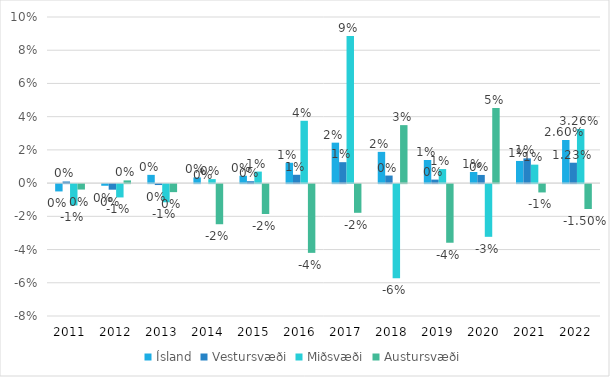
| Category | Ísland | Vestursvæði | Miðsvæði | Austursvæði |
|---|---|---|---|---|
| 2011 | -0.004 | 0.001 | -0.013 | -0.003 |
| 2012 | -0.001 | -0.003 | -0.008 | 0.002 |
| 2013 | 0.005 | -0.001 | -0.011 | -0.005 |
| 2014 | 0.003 | 0 | 0.002 | -0.024 |
| 2015 | 0.004 | 0.001 | 0.007 | -0.018 |
| 2016 | 0.012 | 0.005 | 0.038 | -0.041 |
| 2017 | 0.024 | 0.013 | 0.088 | -0.017 |
| 2018 | 0.019 | 0.005 | -0.057 | 0.035 |
| 2019 | 0.014 | 0.002 | 0.008 | -0.035 |
| 2020 | 0.007 | 0.005 | -0.032 | 0.045 |
| 2021 | 0.013 | 0.015 | 0.011 | -0.005 |
| 2022 | 0.026 | 0.012 | 0.033 | -0.015 |